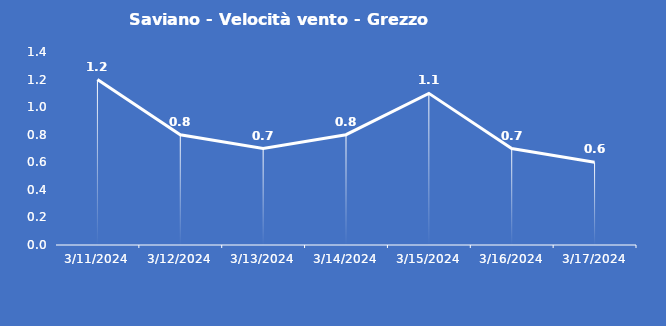
| Category | Saviano - Velocità vento - Grezzo (m/s) |
|---|---|
| 3/11/24 | 1.2 |
| 3/12/24 | 0.8 |
| 3/13/24 | 0.7 |
| 3/14/24 | 0.8 |
| 3/15/24 | 1.1 |
| 3/16/24 | 0.7 |
| 3/17/24 | 0.6 |